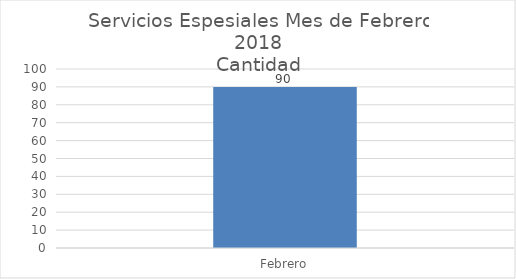
| Category | Series 0 |
|---|---|
| Febrero | 90 |